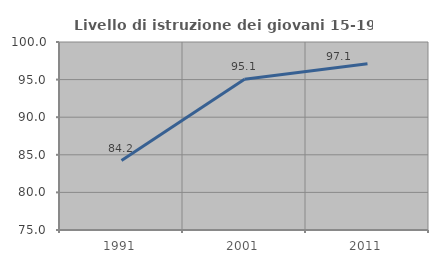
| Category | Livello di istruzione dei giovani 15-19 anni |
|---|---|
| 1991.0 | 84.241 |
| 2001.0 | 95.058 |
| 2011.0 | 97.095 |